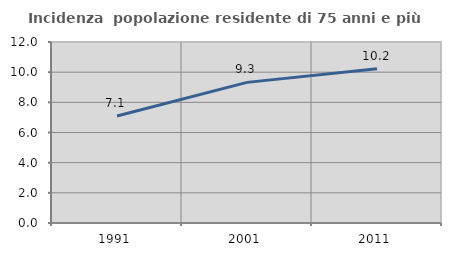
| Category | Incidenza  popolazione residente di 75 anni e più |
|---|---|
| 1991.0 | 7.096 |
| 2001.0 | 9.323 |
| 2011.0 | 10.229 |